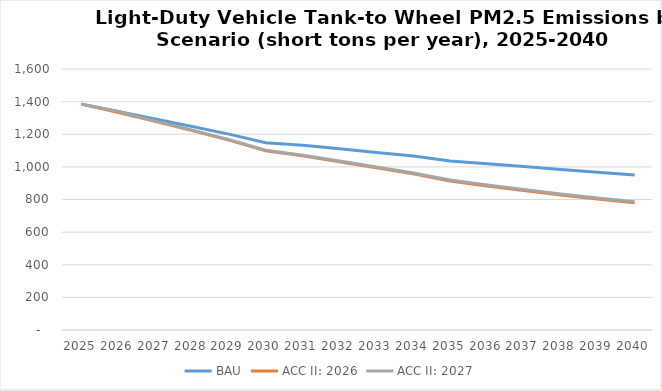
| Category | BAU | ACC II: 2026 | ACC II: 2027 |
|---|---|---|---|
| 2025.0 | 1384.528 | 1384.528 | 1384.528 |
| 2026.0 | 1339.465 | 1333.457 | 1339.465 |
| 2027.0 | 1294.342 | 1279.519 | 1280.593 |
| 2028.0 | 1248.08 | 1222.962 | 1224.729 |
| 2029.0 | 1200.748 | 1163.965 | 1166.472 |
| 2030.0 | 1147.52 | 1098.374 | 1101.603 |
| 2031.0 | 1131.861 | 1067.865 | 1071.89 |
| 2032.0 | 1110.648 | 1031.542 | 1036.278 |
| 2033.0 | 1088.704 | 994.493 | 999.828 |
| 2034.0 | 1066.199 | 957.167 | 962.965 |
| 2035.0 | 1036.127 | 913.486 | 919.568 |
| 2036.0 | 1019.063 | 882.917 | 889.168 |
| 2037.0 | 1002.013 | 854.892 | 861.103 |
| 2038.0 | 984.445 | 827.934 | 833.967 |
| 2039.0 | 967.197 | 803.633 | 809.276 |
| 2040.0 | 949.501 | 780.781 | 785.863 |